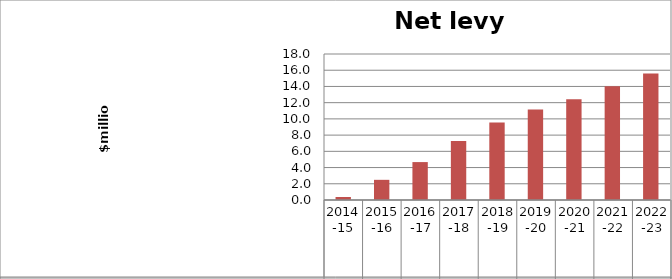
| Category | Net tax effect (incl, NSW and Commonwealth) |
|---|---|
| 2014-15 | 0.368 |
| 2015-16 | 2.487 |
| 2016-17 | 4.675 |
| 2017-18 | 7.275 |
| 2018-19 | 9.567 |
| 2019-20 | 11.145 |
| 2020-21 | 12.425 |
| 2021-22 | 14.013 |
| 2022-23 | 15.597 |